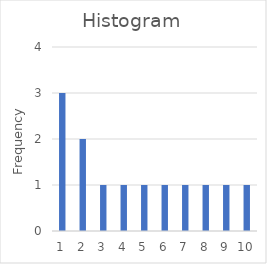
| Category | Frequency |
|---|---|
| 0 | 3 |
| 1 | 2 |
| 2 | 1 |
| 3 | 1 |
| 4 | 1 |
| 5 | 1 |
| 6 | 1 |
| 7 | 1 |
| 8 | 1 |
| 9 | 1 |